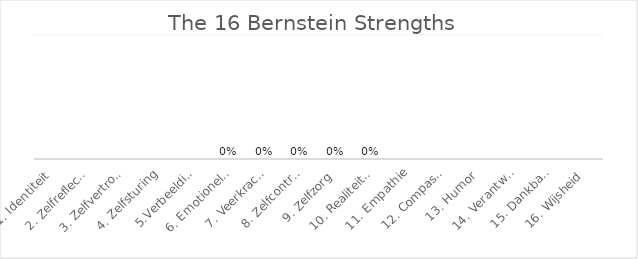
| Category | Series 0 |
|---|---|
| 1. Identiteit | 0 |
| 2. Zelfreflectie | 0 |
| 3. Zelfvertrouwen | 0 |
| 4. Zelfsturing | 0 |
| 5.Verbeelding | 0 |
| 6. Emotionele balans | 0 |
| 7. Veerkracht | 0 |
| 8. Zelfcontrole | 0 |
| 9. Zelfzorg | 0 |
| 10. Realiteitstoetsing | 0 |
| 11. Empathie | 0 |
| 12. Compassie | 0 |
| 13. Humor | 0 |
| 14. Verantwoordelijkheid | 0 |
| 15. Dankbaarheid | 0 |
| 16. Wijsheid | 0 |